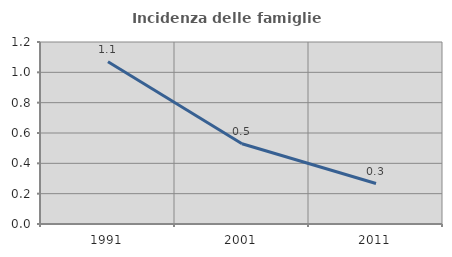
| Category | Incidenza delle famiglie numerose |
|---|---|
| 1991.0 | 1.07 |
| 2001.0 | 0.529 |
| 2011.0 | 0.267 |